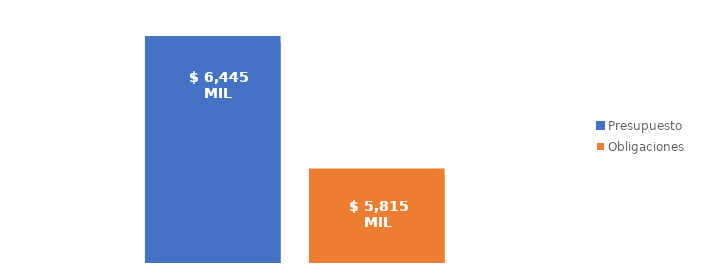
| Category | Presupuesto | Obligaciones |
|---|---|---|
| Total | 6445441196535.715 | 5814870764555.504 |